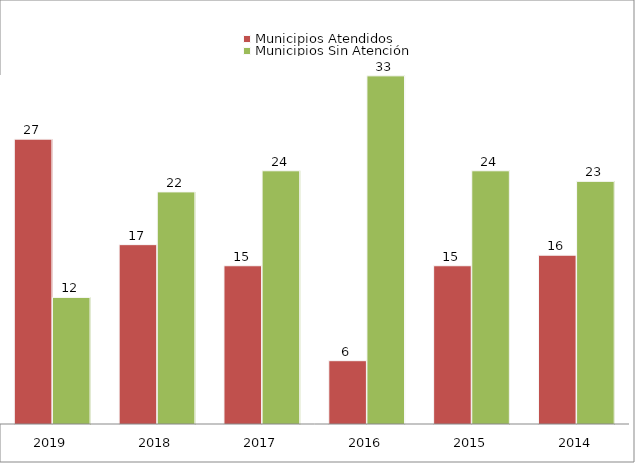
| Category | Municipios Atendidos | Municipios Sin Atención |
|---|---|---|
| 2019.0 | 27 | 12 |
| 2018.0 | 17 | 22 |
| 2017.0 | 15 | 24 |
| 2016.0 | 6 | 33 |
| 2015.0 | 15 | 24 |
| 2014.0 | 16 | 23 |